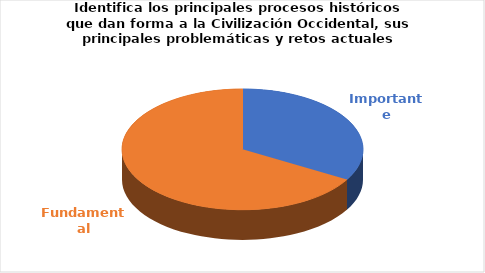
| Category | Series 0 |
|---|---|
| Importante | 4 |
| Fundamental | 8 |